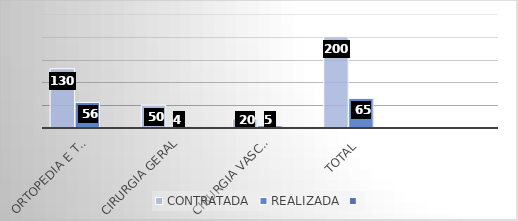
| Category | CONTRATADA | REALIZADA | Series 2 |
|---|---|---|---|
| Ortopedia e traumatologia | 130 | 56 |  |
| Cirurgia Geral | 50 | 4 |  |
| Cirurgia Vascular | 20 | 5 |  |
| TOTAL | 200 | 65 |  |